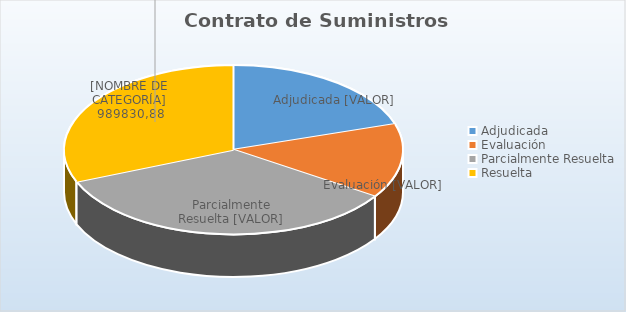
| Category | Suministros |
|---|---|
| Adjudicada | 638568.88 |
| Evaluación | 450817.72 |
| Parcialmente Resuelta | 1096519.42 |
| Resuelta | 989830.88 |